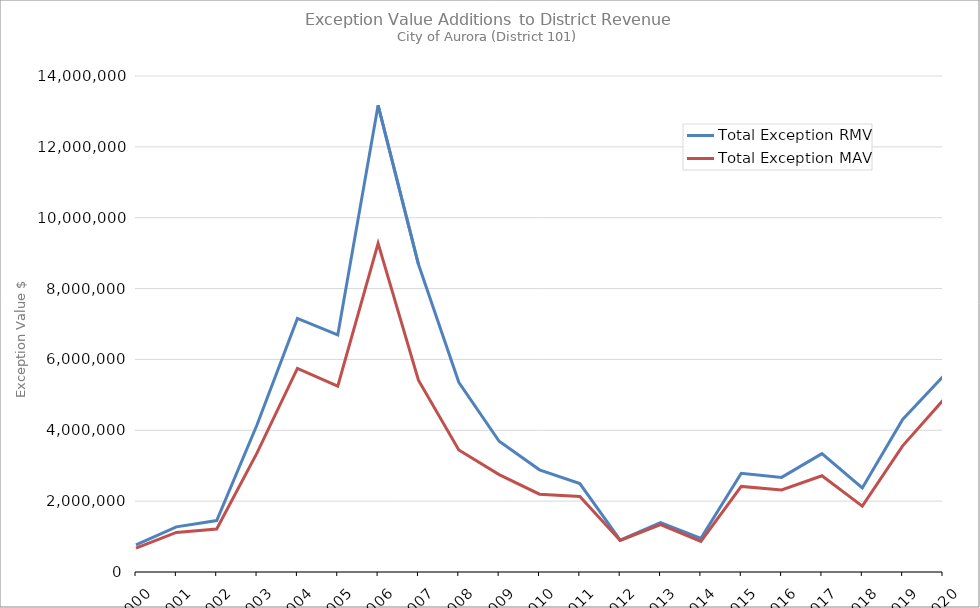
| Category | Total Exception RMV | Total Exception MAV |
|---|---|---|
| 2000.0 | 763164 | 675953 |
| 2001.0 | 1273915 | 1117015 |
| 2002.0 | 1450713 | 1213660 |
| 2003.0 | 4156413 | 3361633 |
| 2004.0 | 7157247 | 5745887 |
| 2005.0 | 6692613 | 5245028 |
| 2006.0 | 13171689 | 9275499 |
| 2007.0 | 8683528 | 5412288 |
| 2008.0 | 5353860 | 3443260 |
| 2009.0 | 3689080 | 2749890 |
| 2010.0 | 2884018 | 2195663 |
| 2011.0 | 2494746 | 2131886 |
| 2012.0 | 900933 | 889143 |
| 2013.0 | 1393175 | 1336195 |
| 2014.0 | 949170 | 860740 |
| 2015.0 | 2785848 | 2415261 |
| 2016.0 | 2670089 | 2315339 |
| 2017.0 | 3341948 | 2715258 |
| 2018.0 | 2371933 | 1859983 |
| 2019.0 | 4308200 | 3560060 |
| 2020.0 | 5517056 | 4844986 |